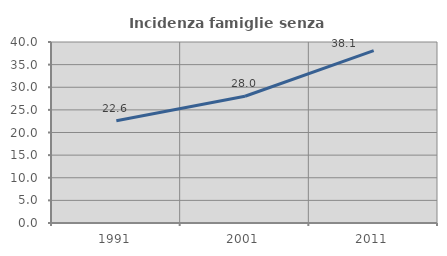
| Category | Incidenza famiglie senza nuclei |
|---|---|
| 1991.0 | 22.577 |
| 2001.0 | 28.004 |
| 2011.0 | 38.095 |